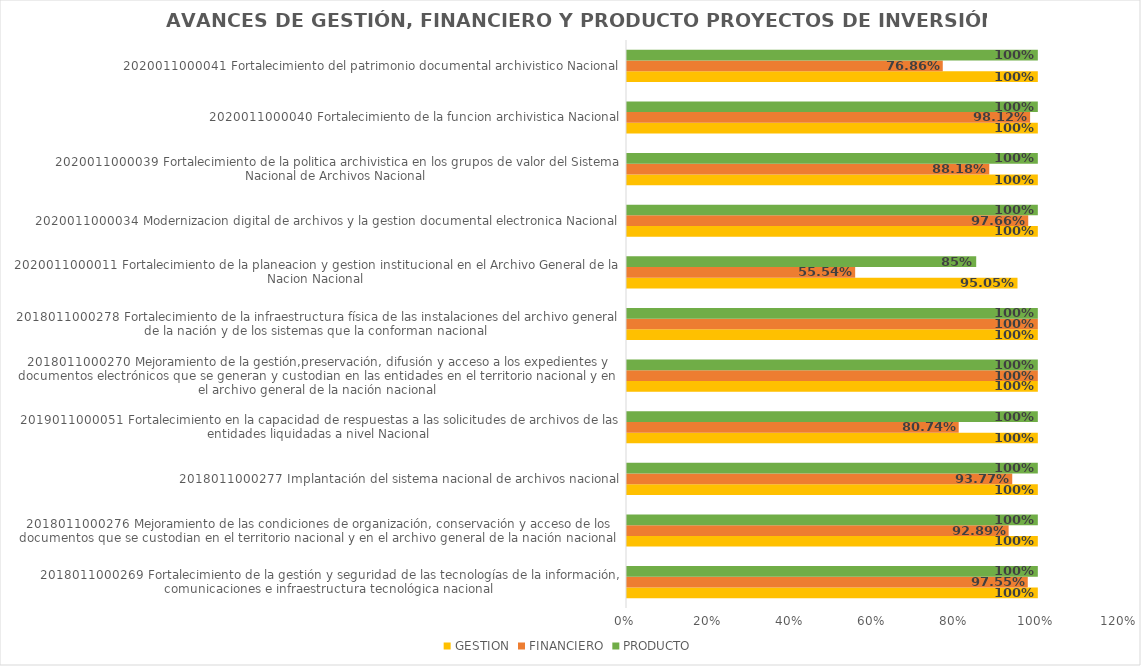
| Category | GESTION | FINANCIERO | PRODUCTO |
|---|---|---|---|
| 2018011000269 Fortalecimiento de la gestión y seguridad de las tecnologías de la información, comunicaciones e infraestructura tecnológica nacional | 1 | 0.976 | 1 |
| 2018011000276 Mejoramiento de las condiciones de organización, conservación y acceso de los documentos que se custodian en el territorio nacional y en el archivo general de la nación nacional | 1 | 0.929 | 1 |
| 2018011000277 Implantación del sistema nacional de archivos nacional | 1 | 0.938 | 1 |
| 2019011000051 Fortalecimiento en la capacidad de respuestas a las solicitudes de archivos de las entidades liquidadas a nivel Nacional | 1 | 0.807 | 1 |
| 2018011000270 Mejoramiento de la gestión,preservación, difusión y acceso a los expedientes y documentos electrónicos que se generan y custodian en las entidades en el territorio nacional y en el archivo general de la nación nacional | 1 | 1 | 1 |
| 2018011000278 Fortalecimiento de la infraestructura física de las instalaciones del archivo general de la nación y de los sistemas que la conforman nacional | 1 | 1 | 1 |
| 2020011000011 Fortalecimiento de la planeacion y gestion institucional en el Archivo General de la Nacion Nacional | 0.95 | 0.555 | 0.85 |
| 2020011000034 Modernizacion digital de archivos y la gestion documental electronica Nacional | 1 | 0.977 | 1 |
| 2020011000039 Fortalecimiento de la politica archivistica en los grupos de valor del Sistema Nacional de Archivos Nacional | 1 | 0.882 | 1 |
| 2020011000040 Fortalecimiento de la funcion archivistica Nacional | 1 | 0.981 | 1 |
| 2020011000041 Fortalecimiento del patrimonio documental archivistico Nacional | 1 | 0.769 | 1 |